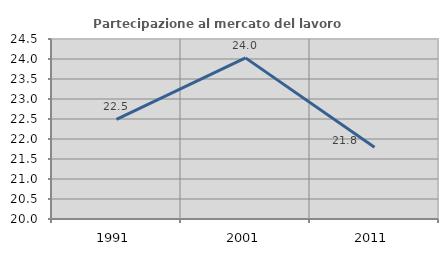
| Category | Partecipazione al mercato del lavoro  femminile |
|---|---|
| 1991.0 | 22.491 |
| 2001.0 | 24.028 |
| 2011.0 | 21.795 |